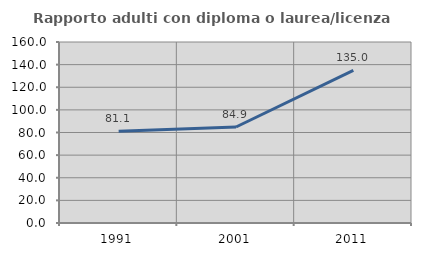
| Category | Rapporto adulti con diploma o laurea/licenza media  |
|---|---|
| 1991.0 | 81.081 |
| 2001.0 | 84.855 |
| 2011.0 | 134.988 |